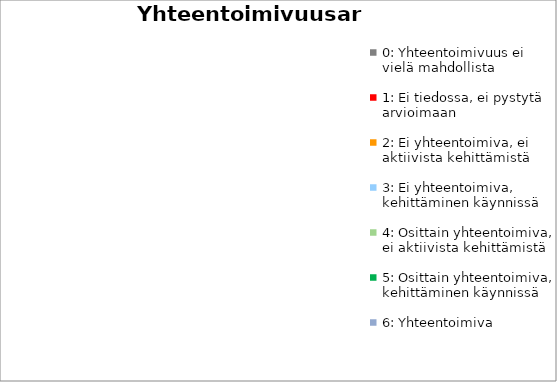
| Category | Series 0 |
|---|---|
| 0: Yhteentoimivuus ei vielä mahdollista | 0 |
| 1: Ei tiedossa, ei pystytä arvioimaan | 0 |
| 2: Ei yhteentoimiva, ei aktiivista kehittämistä | 0 |
| 3: Ei yhteentoimiva, kehittäminen käynnissä | 0 |
| 4: Osittain yhteentoimiva, ei aktiivista kehittämistä | 0 |
| 5: Osittain yhteentoimiva, kehittäminen käynnissä | 0 |
| 6: Yhteentoimiva | 0 |